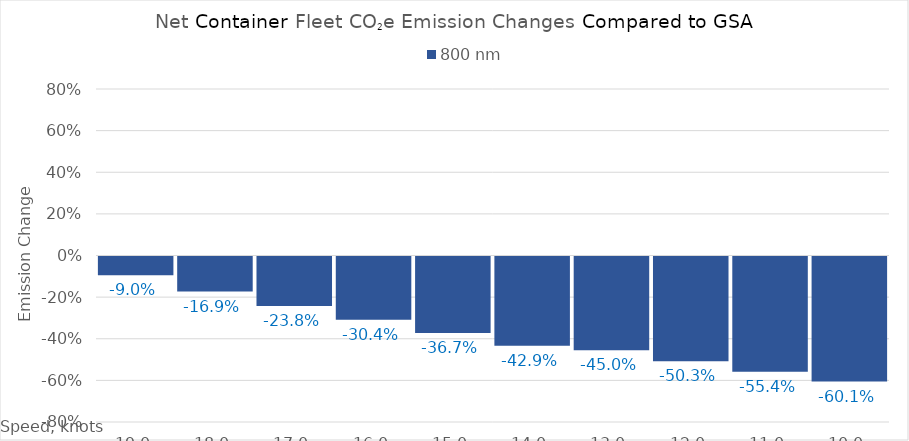
| Category | 800 |
|---|---|
| 19.0 | -0.09 |
| 18.0 | -0.169 |
| 17.0 | -0.238 |
| 16.0 | -0.304 |
| 15.0 | -0.367 |
| 14.0 | -0.429 |
| 13.0 | -0.45 |
| 12.0 | -0.503 |
| 11.0 | -0.554 |
| 10.0 | -0.601 |